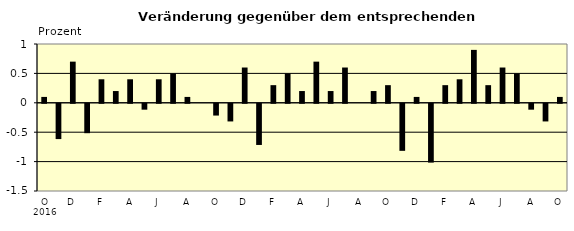
| Category | Series 0 |
|---|---|
| 0 | 0.1 |
| 1 | -0.6 |
| 2 | 0.7 |
| 3 | -0.5 |
| 4 | 0.4 |
| 5 | 0.2 |
| 6 | 0.4 |
| 7 | -0.1 |
| 8 | 0.4 |
| 9 | 0.5 |
| 10 | 0.1 |
| 11 | 0 |
| 12 | -0.2 |
| 13 | -0.3 |
| 14 | 0.6 |
| 15 | -0.7 |
| 16 | 0.3 |
| 17 | 0.5 |
| 18 | 0.2 |
| 19 | 0.7 |
| 20 | 0.2 |
| 21 | 0.6 |
| 22 | 0 |
| 23 | 0.2 |
| 24 | 0.3 |
| 25 | -0.8 |
| 26 | 0.1 |
| 27 | -1 |
| 28 | 0.3 |
| 29 | 0.4 |
| 30 | 0.9 |
| 31 | 0.3 |
| 32 | 0.6 |
| 33 | 0.5 |
| 34 | -0.1 |
| 35 | -0.3 |
| 36 | 0.1 |